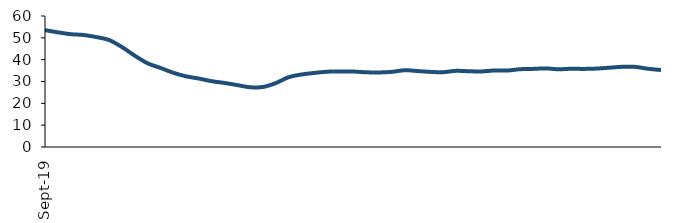
| Category | Series 0 |
|---|---|
| 2019-09-01 | 53.526 |
| 2019-10-01 | 52.526 |
| 2019-11-01 | 51.664 |
| 2019-12-01 | 51.311 |
| 2020-01-01 | 50.348 |
| 2020-02-01 | 48.978 |
| 2020-03-01 | 45.766 |
| 2020-04-01 | 41.808 |
| 2020-05-01 | 38.31 |
| 2020-06-01 | 36.214 |
| 2020-07-01 | 33.993 |
| 2020-08-01 | 32.365 |
| 2020-09-01 | 31.338 |
| 2020-10-01 | 30.13 |
| 2020-11-01 | 29.326 |
| 2020-12-01 | 28.333 |
| 2021-01-01 | 27.356 |
| 2021-02-01 | 27.502 |
| 2021-03-01 | 29.312 |
| 2021-04-01 | 32.007 |
| 2021-05-01 | 33.224 |
| 2021-06-01 | 33.927 |
| 2021-07-01 | 34.496 |
| 2021-08-01 | 34.565 |
| 2021-09-01 | 34.562 |
| 2021-10-01 | 34.221 |
| 2021-11-01 | 34.137 |
| 2021-12-01 | 34.397 |
| 2022-01-01 | 35.154 |
| 2022-02-01 | 34.808 |
| 2022-03-01 | 34.415 |
| 2022-04-01 | 34.261 |
| 2022-05-01 | 34.87 |
| 2022-06-01 | 34.705 |
| 2022-07-01 | 34.592 |
| 2022-08-01 | 35.045 |
| 2022-09-01 | 35.003 |
| 2022-10-01 | 35.616 |
| 2022-11-01 | 35.763 |
| 2022-12-01 | 36.005 |
| 2023-01-01 | 35.604 |
| 2023-02-01 | 35.827 |
| 2023-03-01 | 35.769 |
| 2023-04-01 | 35.924 |
| 2023-05-01 | 36.331 |
| 2023-06-01 | 36.74 |
| 2023-07-01 | 36.693 |
| 2023-08-01 | 35.824 |
| 2023-09-01 | 35.253 |